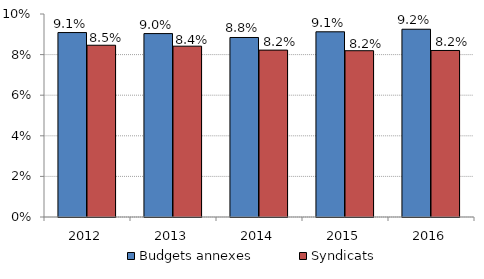
| Category | Budgets annexes | Syndicats  |
|---|---|---|
| 2012.0 | 0.091 | 0.085 |
| 2013.0 | 0.09 | 0.084 |
| 2014.0 | 0.088 | 0.082 |
| 2015.0 | 0.091 | 0.082 |
| 2016.0 | 0.092 | 0.082 |